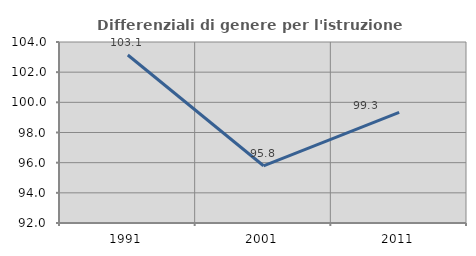
| Category | Differenziali di genere per l'istruzione superiore |
|---|---|
| 1991.0 | 103.139 |
| 2001.0 | 95.794 |
| 2011.0 | 99.33 |